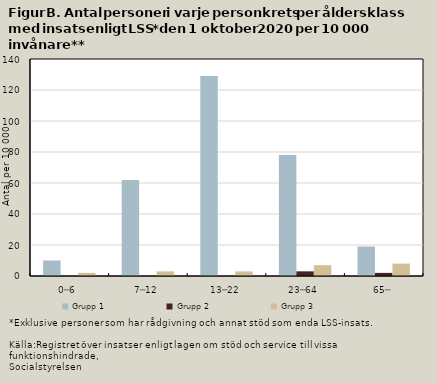
| Category | Grupp 1 | Grupp 2 | Grupp 3 |
|---|---|---|---|
| 0─6 | 10 | 0 | 2 |
| 7─12 | 62 | 0 | 3 |
| 13─22 | 129 | 0 | 3 |
| 23─64 | 78 | 3 | 7 |
| 65─ | 19 | 2 | 8 |